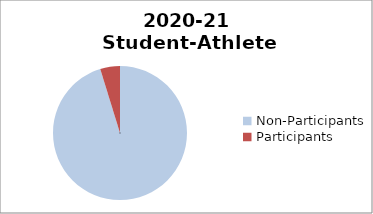
| Category | 2015-16 Student-Athlete Participation (Female) |
|---|---|
| Non-Participants | 760 |
| Participants | 38 |